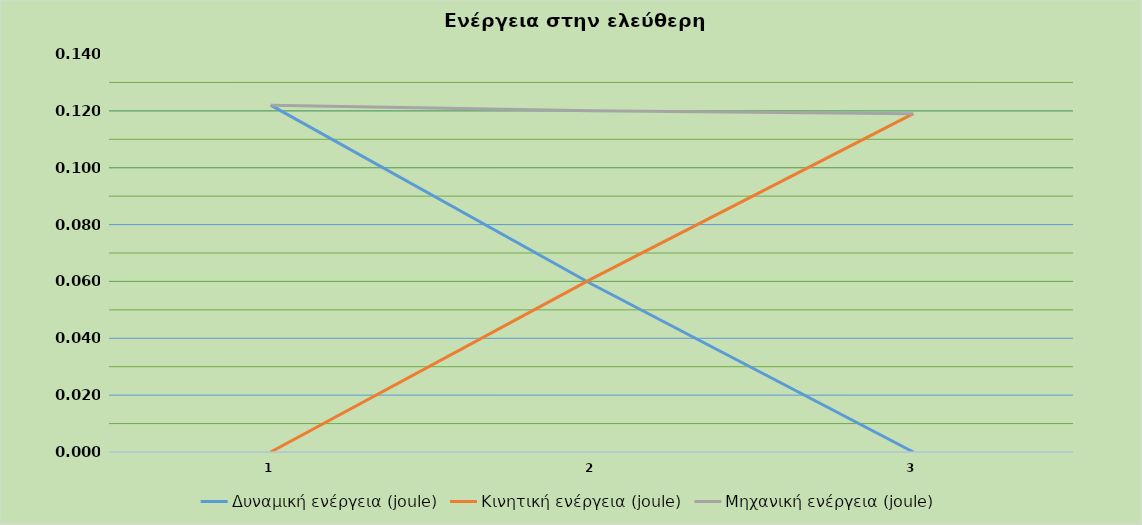
| Category | Δυναμική ενέργεια (joule) | Κινητική ενέργεια (joule) | Μηχανική ενέργεια (joule) |
|---|---|---|---|
| 0 | 0.122 | 0 | 0.122 |
| 1 | 0.059 | 0.061 | 0.12 |
| 2 | 0 | 0.119 | 0.119 |